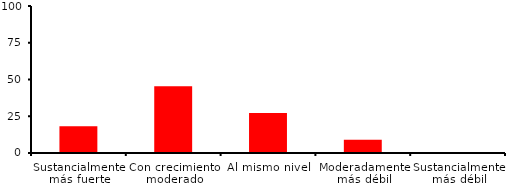
| Category | Series 0 |
|---|---|
| Sustancialmente más fuerte | 18.182 |
| Con crecimiento moderado | 45.455 |
| Al mismo nivel | 27.273 |
| Moderadamente más débil | 9.091 |
| Sustancialmente más débil | 0 |